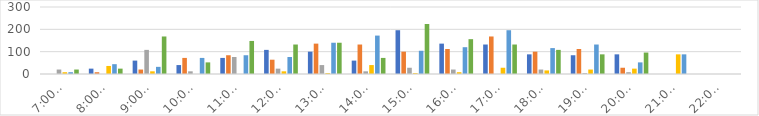
| Category | Series 0 | Series 1 | Series 2 | Series 3 | Series 4 | Series 5 |
|---|---|---|---|---|---|---|
| 7:00-8:00 | 0 | 0 | 20 | 8 | 8 | 20 |
| 8:00-9:00 | 24 | 8 | 0 | 36 | 44 | 24 |
| 9:00-10:00 | 60 | 20 | 108 | 12 | 32 | 168 |
| 10:00-11:00 | 40 | 72 | 12 | 0 | 72 | 52 |
| 11:00-12:00 | 72 | 84 | 76 | 0 | 84 | 148 |
| 12:00-13:00 | 108 | 64 | 24 | 12 | 76 | 132 |
| 13:00-14:00 | 100 | 136 | 40 | 4 | 140 | 140 |
| 14:00-15:00 | 60 | 132 | 12 | 40 | 172 | 72 |
| 15:00-16:00 | 196 | 100 | 28 | 4 | 104 | 224 |
| 16:00-17:00 | 136 | 112 | 20 | 8 | 120 | 156 |
| 17:00-18:00 | 132 | 168 | 0 | 28 | 196 | 132 |
| 18:00-19:00 | 88 | 100 | 20 | 16 | 116 | 108 |
| 19:00-20:00 | 84 | 112 | 4 | 20 | 132 | 88 |
| 20:00-21:00 | 88 | 28 | 8 | 24 | 52 | 96 |
| 21:00-22:00 | 0 | 0 | 0 | 88 | 88 | 0 |
| 22:00-23:00 | 0 | 0 | 0 | 0 | 0 | 0 |